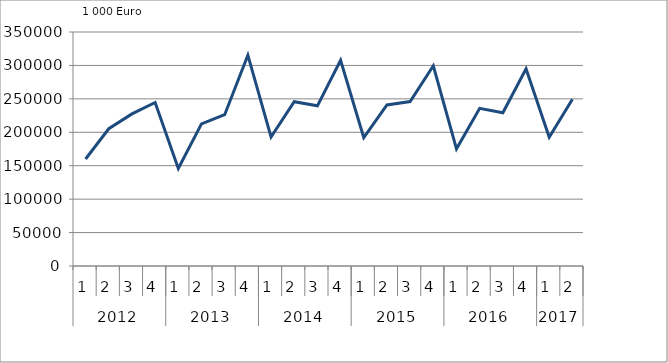
| Category | Ausbaugewerblicher Umsatz3 |
|---|---|
| 0 | 160065 |
| 1 | 205323 |
| 2 | 227469 |
| 3 | 244537 |
| 4 | 145792.596 |
| 5 | 212577 |
| 6 | 226327.748 |
| 7 | 315433.896 |
| 8 | 193004.858 |
| 9 | 245754.159 |
| 10 | 239547.85 |
| 11 | 307688.935 |
| 12 | 192043.756 |
| 13 | 240826.879 |
| 14 | 245916.087 |
| 15 | 299455.378 |
| 16 | 175225.59 |
| 17 | 235781.631 |
| 18 | 229227.559 |
| 19 | 294992.157 |
| 20 | 192499.539 |
| 21 | 249394.388 |